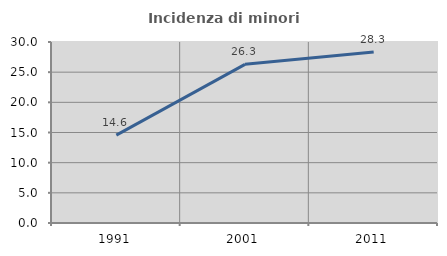
| Category | Incidenza di minori stranieri |
|---|---|
| 1991.0 | 14.563 |
| 2001.0 | 26.296 |
| 2011.0 | 28.331 |